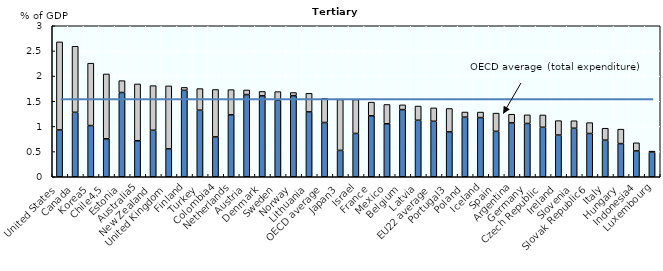
| Category | Public expenditure on education institutions | Private expenditure on education institutions |
|---|---|---|
| United States | 0.931 | 1.749 |
| Canada | 1.28 | 1.313 |
| Korea5 | 1.018 | 1.239 |
| Chile4,5 | 0.755 | 1.288 |
| Estonia | 1.674 | 0.236 |
| Australia5 | 0.716 | 1.128 |
| New Zealand | 0.924 | 0.886 |
| United Kingdom | 0.554 | 1.251 |
| Finland | 1.717 | 0.058 |
| Turkey | 1.323 | 0.429 |
| Colombia4 | 0.792 | 0.942 |
| Netherlands | 1.231 | 0.5 |
| Austria | 1.633 | 0.091 |
| Denmark | 1.608 | 0.087 |
| Sweden | 1.52 | 0.172 |
| Norway | 1.611 | 0.062 |
| Lithuania | 1.289 | 0.369 |
| OECD average | 1.078 | 0.48 |
| Japan3 | 0.524 | 1.012 |
| Israel | 0.861 | 0.674 |
| France | 1.212 | 0.271 |
| Mexico | 1.053 | 0.383 |
| Belgium | 1.334 | 0.095 |
| Latvia | 1.123 | 0.282 |
| EU22 average | 1.102 | 0.266 |
| Portugal3 | 0.892 | 0.465 |
| Poland | 1.184 | 0.102 |
| Iceland | 1.176 | 0.109 |
| Spain | 0.903 | 0.362 |
| Argentina | 1.07 | 0.172 |
| Germany | 1.059 | 0.171 |
| Czech Republic | 0.983 | 0.245 |
| Ireland | 0.828 | 0.287 |
| Slovenia | 0.964 | 0.149 |
| Slovak Republic6 | 0.86 | 0.216 |
| Italy | 0.727 | 0.237 |
| Hungary | 0.659 | 0.287 |
| Indonesia4 | 0.514 | 0.161 |
| Luxembourg | 0.489 | 0.02 |